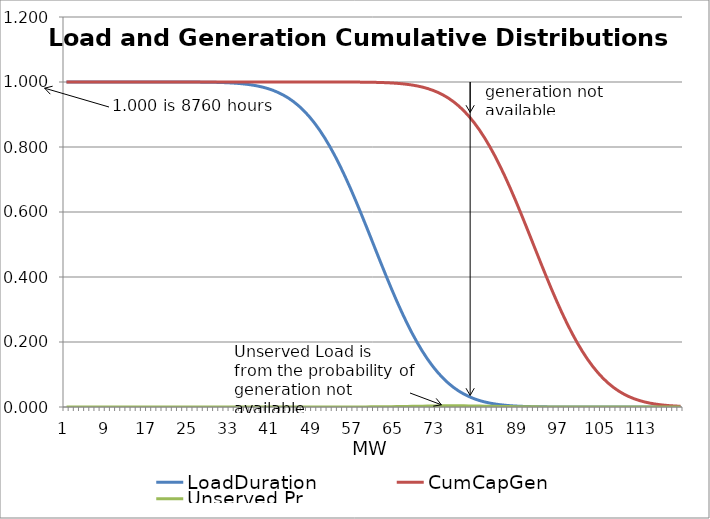
| Category | LoadDuration | CumCapGen | Unserved Pr |
|---|---|---|---|
| 0 | 1 | 1 | 0 |
| 1 | 1 | 1 | 0 |
| 2 | 1 | 1 | 0 |
| 3 | 1 | 1 | 0 |
| 4 | 1 | 1 | 0 |
| 5 | 1 | 1 | 0 |
| 6 | 1 | 1 | 0 |
| 7 | 1 | 1 | 0 |
| 8 | 1 | 1 | 0 |
| 9 | 1 | 1 | 0 |
| 10 | 1 | 1 | 0 |
| 11 | 1 | 1 | 0 |
| 12 | 1 | 1 | 0 |
| 13 | 1 | 1 | 0 |
| 14 | 1 | 1 | 0 |
| 15 | 1 | 1 | 0 |
| 16 | 1 | 1 | 0 |
| 17 | 1 | 1 | 0 |
| 18 | 1 | 1 | 0 |
| 19 | 1 | 1 | 0 |
| 20 | 1 | 1 | 0 |
| 21 | 1 | 1 | 0 |
| 22 | 1 | 1 | 0 |
| 23 | 1 | 1 | 0 |
| 24 | 1 | 1 | 0 |
| 25 | 1 | 1 | 0 |
| 26 | 1 | 1 | 0 |
| 27 | 0.999 | 1 | 0 |
| 28 | 0.999 | 1 | 0 |
| 29 | 0.999 | 1 | 0 |
| 30 | 0.998 | 1 | 0 |
| 31 | 0.998 | 1 | 0 |
| 32 | 0.997 | 1 | 0 |
| 33 | 0.996 | 1 | 0 |
| 34 | 0.995 | 1 | 0 |
| 35 | 0.993 | 1 | 0 |
| 36 | 0.991 | 1 | 0 |
| 37 | 0.988 | 1 | 0 |
| 38 | 0.984 | 1 | 0 |
| 39 | 0.98 | 1 | 0 |
| 40 | 0.974 | 1 | 0 |
| 41 | 0.968 | 1 | 0 |
| 42 | 0.96 | 1 | 0 |
| 43 | 0.951 | 1 | 0 |
| 44 | 0.94 | 1 | 0 |
| 45 | 0.927 | 1 | 0 |
| 46 | 0.912 | 1 | 0 |
| 47 | 0.894 | 1 | 0 |
| 48 | 0.875 | 1 | 0 |
| 49 | 0.853 | 1 | 0 |
| 50 | 0.829 | 1 | 0 |
| 51 | 0.802 | 1 | 0 |
| 52 | 0.773 | 1 | 0 |
| 53 | 0.742 | 1 | 0 |
| 54 | 0.709 | 1 | 0 |
| 55 | 0.674 | 1 | 0 |
| 56 | 0.637 | 1 | 0 |
| 57 | 0.599 | 1 | 0 |
| 58 | 0.56 | 0.999 | 0 |
| 59 | 0.52 | 0.999 | 0 |
| 60 | 0.48 | 0.999 | 0.001 |
| 61 | 0.44 | 0.998 | 0.001 |
| 62 | 0.401 | 0.998 | 0.001 |
| 63 | 0.363 | 0.997 | 0.001 |
| 64 | 0.326 | 0.996 | 0.001 |
| 65 | 0.291 | 0.995 | 0.002 |
| 66 | 0.258 | 0.993 | 0.002 |
| 67 | 0.227 | 0.991 | 0.002 |
| 68 | 0.198 | 0.988 | 0.002 |
| 69 | 0.171 | 0.984 | 0.003 |
| 70 | 0.147 | 0.98 | 0.003 |
| 71 | 0.125 | 0.974 | 0.003 |
| 72 | 0.106 | 0.968 | 0.003 |
| 73 | 0.088 | 0.96 | 0.004 |
| 74 | 0.073 | 0.951 | 0.004 |
| 75 | 0.06 | 0.94 | 0.004 |
| 76 | 0.049 | 0.927 | 0.004 |
| 77 | 0.04 | 0.912 | 0.004 |
| 78 | 0.032 | 0.894 | 0.003 |
| 79 | 0.026 | 0.875 | 0.003 |
| 80 | 0.02 | 0.853 | 0.003 |
| 81 | 0.016 | 0.829 | 0.003 |
| 82 | 0.012 | 0.802 | 0.002 |
| 83 | 0.009 | 0.773 | 0.002 |
| 84 | 0.007 | 0.742 | 0.002 |
| 85 | 0.005 | 0.709 | 0.002 |
| 86 | 0.004 | 0.674 | 0.001 |
| 87 | 0.003 | 0.637 | 0.001 |
| 88 | 0.002 | 0.599 | 0.001 |
| 89 | 0.002 | 0.56 | 0.001 |
| 90 | 0.001 | 0.52 | 0.001 |
| 91 | 0.001 | 0.48 | 0 |
| 92 | 0.001 | 0.44 | 0 |
| 93 | 0 | 0.401 | 0 |
| 94 | 0 | 0.363 | 0 |
| 95 | 0 | 0.326 | 0 |
| 96 | 0 | 0.291 | 0 |
| 97 | 0 | 0.258 | 0 |
| 98 | 0 | 0.227 | 0 |
| 99 | 0 | 0.198 | 0 |
| 100 | 0 | 0.171 | 0 |
| 101 | 0 | 0.147 | 0 |
| 102 | 0 | 0.125 | 0 |
| 103 | 0 | 0.106 | 0 |
| 104 | 0 | 0.088 | 0 |
| 105 | 0 | 0.073 | 0 |
| 106 | 0 | 0.06 | 0 |
| 107 | 0 | 0.049 | 0 |
| 108 | 0 | 0.04 | 0 |
| 109 | 0 | 0.032 | 0 |
| 110 | 0 | 0.026 | 0 |
| 111 | 0 | 0.02 | 0 |
| 112 | 0 | 0.016 | 0 |
| 113 | 0 | 0.012 | 0 |
| 114 | 0 | 0.009 | 0 |
| 115 | 0 | 0.007 | 0 |
| 116 | 0 | 0.005 | 0 |
| 117 | 0 | 0.004 | 0 |
| 118 | 0 | 0.003 | 0 |
| 119 | 0 | 0.002 | 0 |